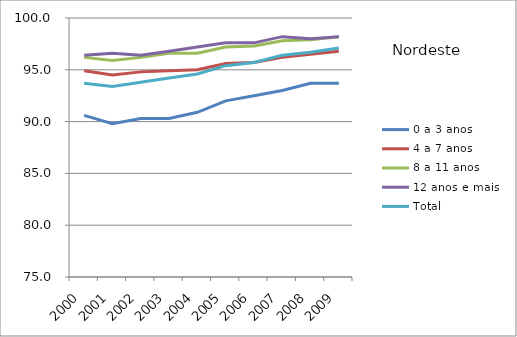
| Category | 0 a 3 anos | 4 a 7 anos | 8 a 11 anos | 12 anos e mais | Total |
|---|---|---|---|---|---|
| 2000.0 | 90.6 | 94.9 | 96.2 | 96.4 | 93.7 |
| 2001.0 | 89.8 | 94.5 | 95.9 | 96.6 | 93.4 |
| 2002.0 | 90.3 | 94.8 | 96.2 | 96.4 | 93.8 |
| 2003.0 | 90.3 | 94.9 | 96.6 | 96.8 | 94.2 |
| 2004.0 | 90.9 | 95 | 96.6 | 97.2 | 94.6 |
| 2005.0 | 92 | 95.6 | 97.2 | 97.6 | 95.4 |
| 2006.0 | 92.5 | 95.7 | 97.3 | 97.6 | 95.7 |
| 2007.0 | 93 | 96.2 | 97.8 | 98.2 | 96.4 |
| 2008.0 | 93.7 | 96.5 | 97.9 | 98 | 96.7 |
| 2009.0 | 93.7 | 96.8 | 98.2 | 98.2 | 97.1 |